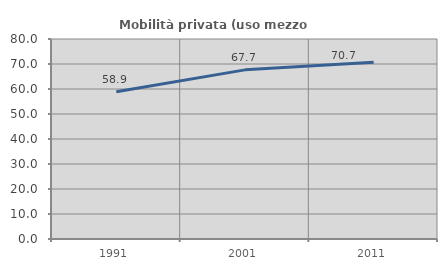
| Category | Mobilità privata (uso mezzo privato) |
|---|---|
| 1991.0 | 58.891 |
| 2001.0 | 67.652 |
| 2011.0 | 70.715 |